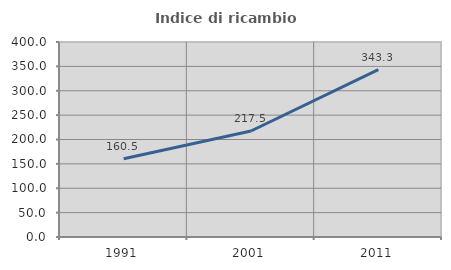
| Category | Indice di ricambio occupazionale  |
|---|---|
| 1991.0 | 160.477 |
| 2001.0 | 217.462 |
| 2011.0 | 343.251 |